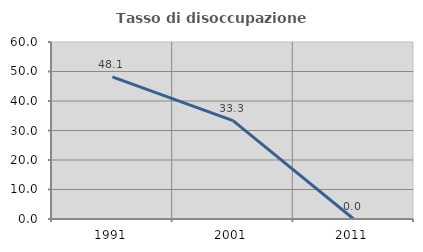
| Category | Tasso di disoccupazione giovanile  |
|---|---|
| 1991.0 | 48.148 |
| 2001.0 | 33.333 |
| 2011.0 | 0 |